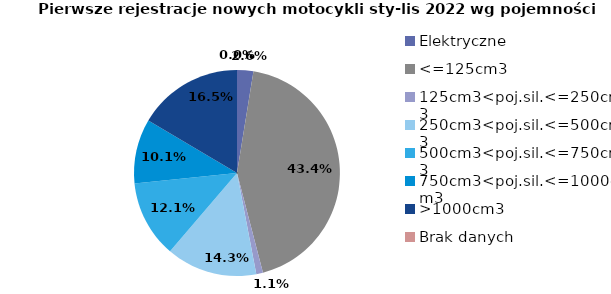
| Category | Series 0 |
|---|---|
| Elektryczne | 612 |
| <=125cm3 | 10373 |
| 125cm3<poj.sil.<=250cm3 | 252 |
| 250cm3<poj.sil.<=500cm3 | 3411 |
| 500cm3<poj.sil.<=750cm3 | 2899 |
| 750cm3<poj.sil.<=1000cm3 | 2416 |
| >1000cm3 | 3947 |
| Brak danych | 0 |